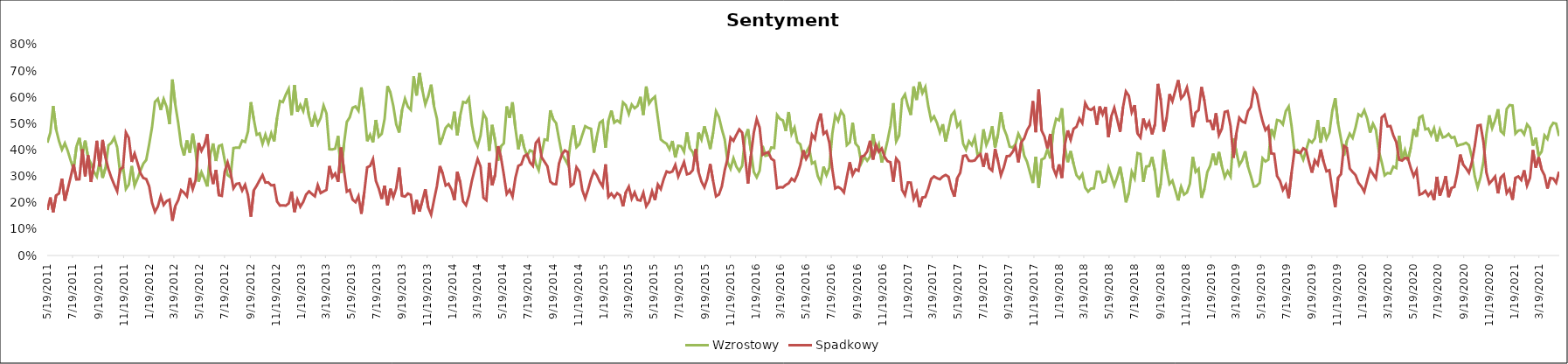
| Category | Wzrostowy | Spadkowy |
|---|---|---|
| 5/19/11 | 0.428 | 0.173 |
| 5/26/11 | 0.465 | 0.22 |
| 6/2/11 | 0.567 | 0.164 |
| 6/9/11 | 0.478 | 0.228 |
| 6/16/11 | 0.434 | 0.235 |
| 6/23/11 | 0.402 | 0.291 |
| 6/30/11 | 0.426 | 0.208 |
| 7/7/11 | 0.397 | 0.252 |
| 7/14/11 | 0.36 | 0.297 |
| 7/21/11 | 0.327 | 0.346 |
| 7/28/11 | 0.413 | 0.288 |
| 8/4/11 | 0.446 | 0.289 |
| 8/11/11 | 0.382 | 0.403 |
| 8/18/11 | 0.436 | 0.3 |
| 8/25/11 | 0.372 | 0.38 |
| 9/1/11 | 0.349 | 0.279 |
| 9/8/11 | 0.317 | 0.345 |
| 9/15/11 | 0.299 | 0.435 |
| 9/22/11 | 0.358 | 0.338 |
| 9/29/11 | 0.295 | 0.438 |
| 10/6/11 | 0.333 | 0.372 |
| 10/13/11 | 0.418 | 0.328 |
| 10/20/11 | 0.427 | 0.295 |
| 10/27/11 | 0.447 | 0.268 |
| 11/3/11 | 0.41 | 0.244 |
| 11/10/11 | 0.315 | 0.327 |
| 11/17/11 | 0.34 | 0.334 |
| 11/24/11 | 0.252 | 0.466 |
| 12/1/11 | 0.269 | 0.446 |
| 12/8/11 | 0.34 | 0.355 |
| 12/15/11 | 0.265 | 0.387 |
| 12/22/11 | 0.292 | 0.351 |
| 12/29/11 | 0.322 | 0.312 |
| 1/5/12 | 0.348 | 0.294 |
| 1/12/12 | 0.363 | 0.29 |
| 1/19/12 | 0.422 | 0.263 |
| 1/26/12 | 0.487 | 0.2 |
| 2/2/12 | 0.583 | 0.166 |
| 2/9/12 | 0.595 | 0.186 |
| 2/16/12 | 0.553 | 0.225 |
| 2/23/12 | 0.593 | 0.192 |
| 3/1/12 | 0.564 | 0.207 |
| 3/8/12 | 0.498 | 0.212 |
| 3/15/12 | 0.668 | 0.132 |
| 3/22/12 | 0.571 | 0.187 |
| 3/29/12 | 0.503 | 0.21 |
| 4/5/12 | 0.419 | 0.248 |
| 4/12/12 | 0.379 | 0.238 |
| 4/19/12 | 0.436 | 0.225 |
| 4/26/12 | 0.39 | 0.294 |
| 5/3/12 | 0.462 | 0.252 |
| 5/10/12 | 0.393 | 0.286 |
| 5/17/12 | 0.28 | 0.427 |
| 5/24/12 | 0.316 | 0.397 |
| 5/31/12 | 0.291 | 0.419 |
| 6/7/12 | 0.262 | 0.46 |
| 6/14/12 | 0.382 | 0.324 |
| 6/21/12 | 0.425 | 0.271 |
| 6/28/12 | 0.359 | 0.324 |
| 7/5/12 | 0.415 | 0.229 |
| 7/12/12 | 0.42 | 0.226 |
| 7/19/12 | 0.36 | 0.318 |
| 7/26/12 | 0.305 | 0.353 |
| 8/2/12 | 0.297 | 0.314 |
| 8/9/12 | 0.408 | 0.255 |
| 8/16/12 | 0.409 | 0.272 |
| 8/23/12 | 0.409 | 0.274 |
| 8/30/12 | 0.436 | 0.246 |
| 9/6/12 | 0.431 | 0.268 |
| 9/13/12 | 0.47 | 0.229 |
| 9/20/12 | 0.582 | 0.147 |
| 9/27/12 | 0.517 | 0.247 |
| 10/4/12 | 0.458 | 0.265 |
| 10/11/12 | 0.463 | 0.286 |
| 10/18/12 | 0.424 | 0.305 |
| 10/25/12 | 0.458 | 0.277 |
| 11/1/12 | 0.426 | 0.278 |
| 11/8/12 | 0.464 | 0.266 |
| 11/15/12 | 0.433 | 0.267 |
| 11/22/12 | 0.522 | 0.205 |
| 11/29/12 | 0.586 | 0.189 |
| 12/6/12 | 0.582 | 0.19 |
| 12/13/12 | 0.61 | 0.189 |
| 12/20/12 | 0.632 | 0.198 |
| 12/27/12 | 0.533 | 0.243 |
| 1/3/13 | 0.647 | 0.165 |
| 1/10/13 | 0.545 | 0.212 |
| 1/17/13 | 0.571 | 0.185 |
| 1/24/13 | 0.548 | 0.203 |
| 1/31/13 | 0.596 | 0.231 |
| 2/7/13 | 0.528 | 0.243 |
| 2/14/13 | 0.489 | 0.233 |
| 2/21/13 | 0.533 | 0.225 |
| 2/28/13 | 0.498 | 0.267 |
| 3/7/13 | 0.522 | 0.237 |
| 3/14/13 | 0.569 | 0.243 |
| 3/21/13 | 0.539 | 0.249 |
| 3/28/13 | 0.403 | 0.34 |
| 4/4/13 | 0.402 | 0.297 |
| 4/11/13 | 0.406 | 0.311 |
| 4/18/13 | 0.453 | 0.28 |
| 4/25/13 | 0.313 | 0.41 |
| 5/2/13 | 0.422 | 0.325 |
| 5/9/13 | 0.507 | 0.242 |
| 5/16/13 | 0.524 | 0.249 |
| 5/23/13 | 0.561 | 0.212 |
| 5/30/13 | 0.566 | 0.202 |
| 6/6/13 | 0.549 | 0.225 |
| 6/13/13 | 0.638 | 0.158 |
| 6/20/13 | 0.553 | 0.24 |
| 6/27/13 | 0.433 | 0.335 |
| 7/4/13 | 0.458 | 0.34 |
| 7/11/13 | 0.429 | 0.366 |
| 7/18/13 | 0.514 | 0.283 |
| 7/25/13 | 0.451 | 0.254 |
| 8/1/13 | 0.462 | 0.214 |
| 8/8/13 | 0.519 | 0.265 |
| 8/15/13 | 0.642 | 0.19 |
| 8/22/13 | 0.618 | 0.253 |
| 8/29/13 | 0.567 | 0.221 |
| 9/5/13 | 0.498 | 0.255 |
| 9/12/13 | 0.467 | 0.333 |
| 9/19/13 | 0.552 | 0.226 |
| 9/26/13 | 0.595 | 0.224 |
| 10/3/13 | 0.564 | 0.235 |
| 10/10/13 | 0.552 | 0.23 |
| 10/17/13 | 0.68 | 0.156 |
| 10/24/13 | 0.607 | 0.211 |
| 10/31/13 | 0.693 | 0.167 |
| 11/7/13 | 0.627 | 0.209 |
| 11/14/13 | 0.573 | 0.252 |
| 11/21/13 | 0.604 | 0.182 |
| 11/28/13 | 0.648 | 0.155 |
| 12/5/13 | 0.566 | 0.211 |
| 12/12/13 | 0.519 | 0.264 |
| 12/19/13 | 0.42 | 0.339 |
| 12/26/13 | 0.45 | 0.31 |
| 1/2/14 | 0.484 | 0.266 |
| 1/9/14 | 0.497 | 0.272 |
| 1/16/14 | 0.484 | 0.25 |
| 1/23/14 | 0.545 | 0.21 |
| 1/30/14 | 0.455 | 0.317 |
| 2/6/14 | 0.531 | 0.278 |
| 2/13/14 | 0.582 | 0.205 |
| 2/20/14 | 0.579 | 0.191 |
| 2/27/14 | 0.597 | 0.227 |
| 3/6/14 | 0.498 | 0.283 |
| 3/13/14 | 0.439 | 0.327 |
| 3/20/14 | 0.415 | 0.366 |
| 3/27/14 | 0.455 | 0.337 |
| 4/3/14 | 0.539 | 0.219 |
| 4/10/14 | 0.519 | 0.21 |
| 4/17/14 | 0.397 | 0.352 |
| 4/24/14 | 0.495 | 0.266 |
| 5/1/14 | 0.437 | 0.306 |
| 5/8/14 | 0.359 | 0.415 |
| 5/15/14 | 0.414 | 0.374 |
| 5/22/14 | 0.425 | 0.307 |
| 5/29/14 | 0.566 | 0.234 |
| 6/5/14 | 0.522 | 0.249 |
| 6/12/14 | 0.581 | 0.224 |
| 6/19/14 | 0.482 | 0.295 |
| 6/26/14 | 0.403 | 0.34 |
| 7/3/14 | 0.459 | 0.345 |
| 7/10/14 | 0.41 | 0.377 |
| 7/17/14 | 0.379 | 0.383 |
| 7/24/14 | 0.399 | 0.353 |
| 7/31/14 | 0.394 | 0.34 |
| 8/7/14 | 0.348 | 0.427 |
| 8/14/14 | 0.324 | 0.441 |
| 8/21/14 | 0.386 | 0.373 |
| 8/28/14 | 0.44 | 0.356 |
| 9/4/14 | 0.438 | 0.338 |
| 9/11/14 | 0.551 | 0.28 |
| 9/18/14 | 0.516 | 0.271 |
| 9/25/14 | 0.502 | 0.271 |
| 10/2/14 | 0.441 | 0.349 |
| 10/9/14 | 0.383 | 0.383 |
| 10/16/14 | 0.366 | 0.398 |
| 10/23/14 | 0.345 | 0.392 |
| 10/30/14 | 0.433 | 0.264 |
| 11/6/14 | 0.494 | 0.272 |
| 11/13/14 | 0.411 | 0.335 |
| 11/20/14 | 0.422 | 0.319 |
| 11/27/14 | 0.457 | 0.248 |
| 12/4/14 | 0.49 | 0.217 |
| 12/11/14 | 0.484 | 0.251 |
| 12/18/14 | 0.481 | 0.29 |
| 12/25/14 | 0.39 | 0.32 |
| 1/1/15 | 0.451 | 0.304 |
| 1/8/15 | 0.503 | 0.28 |
| 1/15/15 | 0.512 | 0.262 |
| 1/22/15 | 0.409 | 0.346 |
| 1/29/15 | 0.511 | 0.222 |
| 2/5/15 | 0.55 | 0.235 |
| 2/12/15 | 0.504 | 0.22 |
| 2/19/15 | 0.512 | 0.236 |
| 2/26/15 | 0.504 | 0.228 |
| 3/5/15 | 0.581 | 0.186 |
| 3/12/15 | 0.57 | 0.241 |
| 3/19/15 | 0.537 | 0.261 |
| 3/26/15 | 0.573 | 0.216 |
| 4/2/15 | 0.559 | 0.239 |
| 4/9/15 | 0.568 | 0.211 |
| 4/16/15 | 0.602 | 0.208 |
| 4/23/15 | 0.533 | 0.238 |
| 4/30/15 | 0.641 | 0.187 |
| 5/7/15 | 0.577 | 0.204 |
| 5/14/15 | 0.593 | 0.243 |
| 5/21/15 | 0.603 | 0.21 |
| 5/28/15 | 0.521 | 0.269 |
| 6/4/15 | 0.44 | 0.252 |
| 6/11/15 | 0.431 | 0.29 |
| 6/18/15 | 0.424 | 0.319 |
| 6/25/15 | 0.403 | 0.314 |
| 7/2/15 | 0.435 | 0.319 |
| 7/9/15 | 0.372 | 0.344 |
| 7/16/15 | 0.416 | 0.3 |
| 7/23/15 | 0.415 | 0.327 |
| 7/30/15 | 0.393 | 0.354 |
| 8/6/15 | 0.467 | 0.308 |
| 8/13/15 | 0.407 | 0.311 |
| 8/20/15 | 0.392 | 0.324 |
| 8/27/15 | 0.357 | 0.403 |
| 9/3/15 | 0.466 | 0.316 |
| 9/10/15 | 0.44 | 0.28 |
| 9/17/15 | 0.49 | 0.259 |
| 9/24/15 | 0.451 | 0.292 |
| 10/1/15 | 0.404 | 0.347 |
| 10/8/15 | 0.466 | 0.283 |
| 10/15/15 | 0.547 | 0.224 |
| 10/22/15 | 0.525 | 0.231 |
| 10/29/15 | 0.479 | 0.262 |
| 11/5/15 | 0.44 | 0.324 |
| 11/12/15 | 0.354 | 0.369 |
| 11/19/15 | 0.329 | 0.447 |
| 11/26/15 | 0.369 | 0.435 |
| 12/3/15 | 0.337 | 0.457 |
| 12/10/15 | 0.32 | 0.478 |
| 12/17/15 | 0.341 | 0.466 |
| 12/24/15 | 0.449 | 0.374 |
| 12/31/15 | 0.479 | 0.273 |
| 1/7/16 | 0.398 | 0.378 |
| 1/14/16 | 0.317 | 0.466 |
| 1/21/16 | 0.297 | 0.517 |
| 1/28/16 | 0.322 | 0.485 |
| 2/4/16 | 0.415 | 0.382 |
| 2/11/16 | 0.378 | 0.388 |
| 2/18/16 | 0.381 | 0.392 |
| 2/25/16 | 0.41 | 0.367 |
| 3/3/16 | 0.408 | 0.36 |
| 3/10/16 | 0.533 | 0.256 |
| 3/17/16 | 0.518 | 0.259 |
| 3/24/16 | 0.513 | 0.258 |
| 3/31/16 | 0.472 | 0.268 |
| 4/7/16 | 0.544 | 0.274 |
| 4/14/16 | 0.461 | 0.292 |
| 4/21/16 | 0.485 | 0.283 |
| 4/28/16 | 0.43 | 0.307 |
| 5/5/16 | 0.422 | 0.343 |
| 5/12/16 | 0.375 | 0.399 |
| 5/19/16 | 0.392 | 0.367 |
| 5/26/16 | 0.411 | 0.386 |
| 6/2/16 | 0.349 | 0.458 |
| 6/9/16 | 0.355 | 0.442 |
| 6/16/16 | 0.302 | 0.504 |
| 6/23/16 | 0.278 | 0.538 |
| 6/30/16 | 0.337 | 0.461 |
| 7/7/16 | 0.305 | 0.471 |
| 7/14/16 | 0.333 | 0.428 |
| 7/21/16 | 0.462 | 0.327 |
| 7/28/16 | 0.531 | 0.254 |
| 8/4/16 | 0.51 | 0.26 |
| 8/11/16 | 0.548 | 0.253 |
| 8/18/16 | 0.531 | 0.239 |
| 8/25/16 | 0.419 | 0.297 |
| 9/1/16 | 0.429 | 0.354 |
| 9/8/16 | 0.504 | 0.306 |
| 9/15/16 | 0.424 | 0.327 |
| 9/22/16 | 0.412 | 0.321 |
| 9/29/16 | 0.351 | 0.375 |
| 10/6/16 | 0.375 | 0.379 |
| 10/13/16 | 0.36 | 0.395 |
| 10/20/16 | 0.375 | 0.435 |
| 10/27/16 | 0.461 | 0.364 |
| 11/3/16 | 0.396 | 0.419 |
| 11/10/16 | 0.421 | 0.394 |
| 11/17/16 | 0.353 | 0.406 |
| 11/24/16 | 0.387 | 0.374 |
| 12/1/16 | 0.436 | 0.358 |
| 12/8/16 | 0.491 | 0.354 |
| 12/15/16 | 0.578 | 0.28 |
| 12/22/16 | 0.433 | 0.368 |
| 12/29/16 | 0.455 | 0.354 |
| 1/5/17 | 0.593 | 0.249 |
| 1/12/17 | 0.611 | 0.229 |
| 1/19/17 | 0.566 | 0.277 |
| 1/26/17 | 0.533 | 0.277 |
| 2/2/17 | 0.641 | 0.215 |
| 2/9/17 | 0.59 | 0.24 |
| 2/16/17 | 0.658 | 0.183 |
| 2/23/17 | 0.616 | 0.22 |
| 3/2/17 | 0.639 | 0.222 |
| 3/9/17 | 0.568 | 0.253 |
| 3/16/17 | 0.513 | 0.29 |
| 3/23/17 | 0.528 | 0.3 |
| 3/30/17 | 0.503 | 0.293 |
| 4/6/17 | 0.467 | 0.289 |
| 4/13/17 | 0.498 | 0.3 |
| 4/20/17 | 0.432 | 0.306 |
| 4/27/17 | 0.481 | 0.298 |
| 5/4/17 | 0.532 | 0.252 |
| 5/11/17 | 0.546 | 0.223 |
| 5/18/17 | 0.49 | 0.294 |
| 5/25/17 | 0.505 | 0.314 |
| 6/1/17 | 0.425 | 0.377 |
| 6/8/17 | 0.402 | 0.38 |
| 6/15/17 | 0.434 | 0.359 |
| 6/22/17 | 0.419 | 0.358 |
| 6/29/17 | 0.447 | 0.361 |
| 7/6/17 | 0.379 | 0.375 |
| 7/13/17 | 0.391 | 0.384 |
| 7/20/17 | 0.479 | 0.336 |
| 7/27/17 | 0.42 | 0.389 |
| 8/3/17 | 0.445 | 0.332 |
| 8/10/17 | 0.49 | 0.322 |
| 8/17/17 | 0.409 | 0.405 |
| 8/24/17 | 0.46 | 0.358 |
| 8/31/17 | 0.544 | 0.304 |
| 9/7/17 | 0.482 | 0.335 |
| 9/14/17 | 0.455 | 0.377 |
| 9/21/17 | 0.413 | 0.378 |
| 9/28/17 | 0.409 | 0.392 |
| 10/5/17 | 0.422 | 0.414 |
| 10/12/17 | 0.462 | 0.353 |
| 10/19/17 | 0.439 | 0.43 |
| 10/26/17 | 0.379 | 0.444 |
| 11/2/17 | 0.355 | 0.475 |
| 11/9/17 | 0.315 | 0.494 |
| 11/16/17 | 0.275 | 0.586 |
| 11/23/17 | 0.375 | 0.467 |
| 11/30/17 | 0.257 | 0.63 |
| 12/7/17 | 0.364 | 0.475 |
| 12/14/17 | 0.369 | 0.451 |
| 12/21/17 | 0.403 | 0.407 |
| 12/28/17 | 0.368 | 0.461 |
| 1/4/18 | 0.473 | 0.332 |
| 1/11/18 | 0.519 | 0.304 |
| 1/18/18 | 0.513 | 0.346 |
| 1/25/18 | 0.559 | 0.294 |
| 2/1/18 | 0.412 | 0.421 |
| 2/8/18 | 0.354 | 0.474 |
| 2/15/18 | 0.396 | 0.439 |
| 2/22/18 | 0.347 | 0.481 |
| 3/1/18 | 0.305 | 0.488 |
| 3/8/18 | 0.291 | 0.52 |
| 3/15/18 | 0.308 | 0.502 |
| 3/22/18 | 0.257 | 0.578 |
| 3/29/18 | 0.242 | 0.557 |
| 4/5/18 | 0.254 | 0.552 |
| 4/12/18 | 0.255 | 0.561 |
| 4/19/18 | 0.318 | 0.496 |
| 4/26/18 | 0.317 | 0.565 |
| 5/3/18 | 0.278 | 0.535 |
| 5/10/18 | 0.282 | 0.564 |
| 5/17/18 | 0.333 | 0.449 |
| 5/24/18 | 0.299 | 0.529 |
| 5/31/18 | 0.266 | 0.56 |
| 6/7/18 | 0.297 | 0.517 |
| 6/14/18 | 0.336 | 0.469 |
| 6/21/18 | 0.277 | 0.562 |
| 6/28/18 | 0.202 | 0.622 |
| 7/5/18 | 0.238 | 0.606 |
| 7/12/18 | 0.317 | 0.543 |
| 7/19/18 | 0.293 | 0.57 |
| 7/26/18 | 0.388 | 0.463 |
| 8/2/18 | 0.385 | 0.448 |
| 8/9/18 | 0.279 | 0.52 |
| 8/16/18 | 0.338 | 0.484 |
| 8/23/18 | 0.339 | 0.507 |
| 8/30/18 | 0.374 | 0.46 |
| 9/6/18 | 0.32 | 0.498 |
| 9/13/18 | 0.221 | 0.651 |
| 9/20/18 | 0.273 | 0.59 |
| 9/27/18 | 0.402 | 0.47 |
| 10/4/18 | 0.329 | 0.521 |
| 10/11/18 | 0.271 | 0.612 |
| 10/18/18 | 0.284 | 0.585 |
| 10/25/18 | 0.247 | 0.626 |
| 11/1/18 | 0.209 | 0.665 |
| 11/8/18 | 0.26 | 0.596 |
| 11/15/18 | 0.231 | 0.609 |
| 11/22/18 | 0.239 | 0.637 |
| 11/29/18 | 0.272 | 0.585 |
| 12/6/18 | 0.374 | 0.487 |
| 12/13/18 | 0.317 | 0.543 |
| 12/20/18 | 0.328 | 0.551 |
| 12/27/18 | 0.219 | 0.639 |
| 1/3/19 | 0.253 | 0.588 |
| 1/10/19 | 0.316 | 0.51 |
| 1/17/19 | 0.341 | 0.511 |
| 1/24/19 | 0.387 | 0.476 |
| 1/31/19 | 0.343 | 0.539 |
| 2/7/19 | 0.392 | 0.457 |
| 2/14/19 | 0.339 | 0.481 |
| 2/21/19 | 0.297 | 0.545 |
| 2/28/19 | 0.32 | 0.548 |
| 3/7/19 | 0.3 | 0.491 |
| 3/14/19 | 0.444 | 0.371 |
| 3/21/19 | 0.394 | 0.463 |
| 3/28/19 | 0.343 | 0.522 |
| 4/4/19 | 0.361 | 0.508 |
| 4/11/19 | 0.396 | 0.504 |
| 4/18/19 | 0.337 | 0.548 |
| 4/25/19 | 0.301 | 0.564 |
| 5/2/19 | 0.261 | 0.631 |
| 5/9/19 | 0.264 | 0.612 |
| 5/16/19 | 0.276 | 0.556 |
| 5/23/19 | 0.369 | 0.51 |
| 5/30/19 | 0.357 | 0.476 |
| 6/6/19 | 0.364 | 0.489 |
| 6/13/19 | 0.48 | 0.387 |
| 6/20/19 | 0.453 | 0.385 |
| 6/27/19 | 0.514 | 0.302 |
| 7/4/19 | 0.511 | 0.283 |
| 7/11/19 | 0.497 | 0.249 |
| 7/18/19 | 0.547 | 0.268 |
| 7/25/19 | 0.565 | 0.217 |
| 8/1/19 | 0.49 | 0.315 |
| 8/8/19 | 0.393 | 0.398 |
| 8/15/19 | 0.4 | 0.391 |
| 8/22/19 | 0.389 | 0.389 |
| 8/29/19 | 0.364 | 0.407 |
| 9/5/19 | 0.4 | 0.4 |
| 9/12/19 | 0.438 | 0.354 |
| 9/19/19 | 0.429 | 0.314 |
| 9/26/19 | 0.444 | 0.361 |
| 10/3/19 | 0.514 | 0.345 |
| 10/10/19 | 0.428 | 0.402 |
| 10/17/19 | 0.487 | 0.356 |
| 10/24/19 | 0.443 | 0.32 |
| 10/31/19 | 0.466 | 0.324 |
| 11/7/19 | 0.549 | 0.249 |
| 11/14/19 | 0.597 | 0.183 |
| 11/21/19 | 0.5 | 0.295 |
| 11/28/19 | 0.441 | 0.309 |
| 12/5/19 | 0.379 | 0.416 |
| 12/12/19 | 0.435 | 0.408 |
| 12/19/19 | 0.462 | 0.33 |
| 12/26/19 | 0.446 | 0.317 |
| 1/2/20 | 0.486 | 0.305 |
| 1/9/20 | 0.536 | 0.276 |
| 1/16/20 | 0.528 | 0.262 |
| 1/23/20 | 0.551 | 0.242 |
| 1/30/20 | 0.519 | 0.286 |
| 2/6/20 | 0.466 | 0.327 |
| 2/13/20 | 0.5 | 0.309 |
| 2/20/20 | 0.477 | 0.292 |
| 2/27/20 | 0.396 | 0.37 |
| 3/5/20 | 0.354 | 0.524 |
| 3/12/20 | 0.304 | 0.534 |
| 3/19/20 | 0.313 | 0.49 |
| 3/26/20 | 0.311 | 0.491 |
| 4/2/20 | 0.337 | 0.455 |
| 4/9/20 | 0.332 | 0.43 |
| 4/16/20 | 0.455 | 0.364 |
| 4/23/20 | 0.36 | 0.36 |
| 4/30/20 | 0.399 | 0.37 |
| 5/7/20 | 0.36 | 0.369 |
| 5/14/20 | 0.41 | 0.332 |
| 5/21/20 | 0.48 | 0.301 |
| 5/28/20 | 0.451 | 0.324 |
| 6/4/20 | 0.524 | 0.231 |
| 6/11/20 | 0.53 | 0.235 |
| 6/18/20 | 0.479 | 0.245 |
| 6/25/20 | 0.482 | 0.227 |
| 7/2/20 | 0.457 | 0.241 |
| 7/9/20 | 0.483 | 0.21 |
| 7/16/20 | 0.433 | 0.299 |
| 7/23/20 | 0.477 | 0.227 |
| 7/30/20 | 0.448 | 0.259 |
| 8/6/20 | 0.451 | 0.301 |
| 8/13/20 | 0.461 | 0.222 |
| 8/20/20 | 0.446 | 0.256 |
| 8/27/20 | 0.45 | 0.26 |
| 9/3/20 | 0.416 | 0.312 |
| 9/10/20 | 0.42 | 0.383 |
| 9/17/20 | 0.423 | 0.345 |
| 9/24/20 | 0.428 | 0.331 |
| 10/1/20 | 0.419 | 0.314 |
| 10/8/20 | 0.373 | 0.353 |
| 10/15/20 | 0.301 | 0.416 |
| 10/22/20 | 0.259 | 0.493 |
| 10/29/20 | 0.297 | 0.495 |
| 11/5/20 | 0.357 | 0.43 |
| 11/12/20 | 0.46 | 0.316 |
| 11/19/20 | 0.532 | 0.273 |
| 11/26/20 | 0.483 | 0.285 |
| 12/3/20 | 0.513 | 0.299 |
| 12/10/20 | 0.555 | 0.236 |
| 12/17/20 | 0.471 | 0.296 |
| 12/24/20 | 0.46 | 0.307 |
| 12/31/20 | 0.556 | 0.237 |
| 1/7/21 | 0.571 | 0.253 |
| 1/14/21 | 0.569 | 0.211 |
| 1/21/21 | 0.462 | 0.295 |
| 1/28/21 | 0.474 | 0.3 |
| 2/4/21 | 0.476 | 0.286 |
| 2/11/21 | 0.46 | 0.323 |
| 2/18/21 | 0.497 | 0.265 |
| 2/25/21 | 0.483 | 0.294 |
| 3/4/21 | 0.417 | 0.4 |
| 3/11/21 | 0.446 | 0.333 |
| 3/18/21 | 0.379 | 0.373 |
| 3/25/21 | 0.394 | 0.326 |
| 4/1/21 | 0.456 | 0.304 |
| 4/8/21 | 0.442 | 0.254 |
| 4/15/21 | 0.485 | 0.294 |
| 4/22/21 | 0.503 | 0.292 |
| 4/29/21 | 0.5 | 0.276 |
| 5/6/21 | 0.453 | 0.318 |